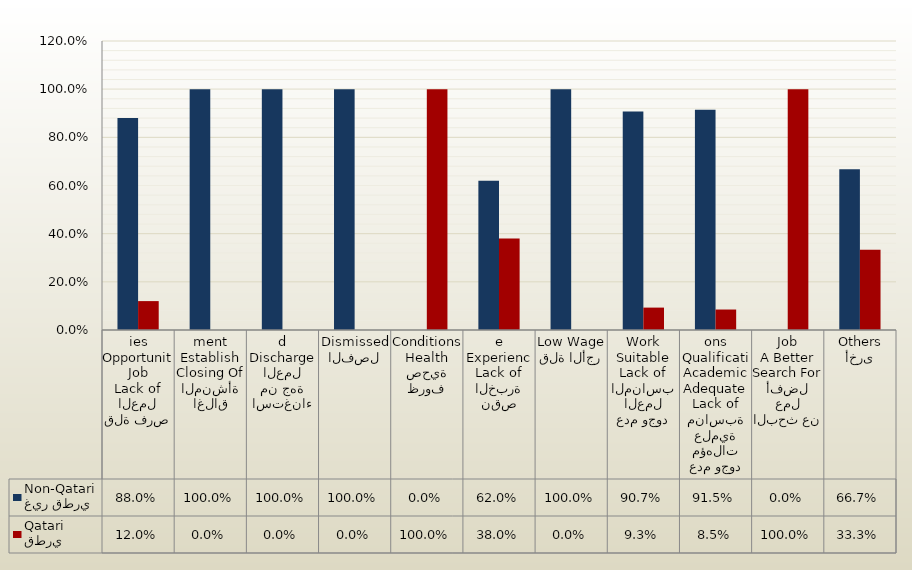
| Category | غير قطري
Non-Qatari | قطري
Qatari |
|---|---|---|
| قلة فرص العمل
Lack of Job Opportunities | 0.88 | 0.12 |
| اغلاق المنشأة
Closing Of Establishment | 1 | 0 |
| استغناء من جهة العمل
Discharged | 1 | 0 |
| الفصل
Dismissed | 1 | 0 |
| ظروف صحية
Health Conditions | 0 | 1 |
| نقص الخبرة
Lack of Experience | 0.62 | 0.38 |
| قلة الأجر
Low Wage | 1 | 0 |
| عدم وجود العمل المناسب
Lack of Suitable Work | 0.907 | 0.093 |
| عدم وجود مؤهلات علمية مناسبة
Lack of Adequate Academic Qualifications | 0.915 | 0.085 |
| البحث عن عمل أفضل
Search For A Better Job | 0 | 1 |
| أخرى
Others | 0.667 | 0.333 |